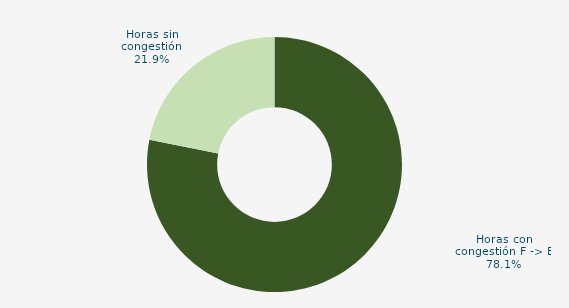
| Category | Horas con congestión E -> F |
|---|---|
| Horas con congestión E -> F | 0 |
| Horas con congestión F -> E | 72.173 |
| Horas sin congestión | 20.238 |